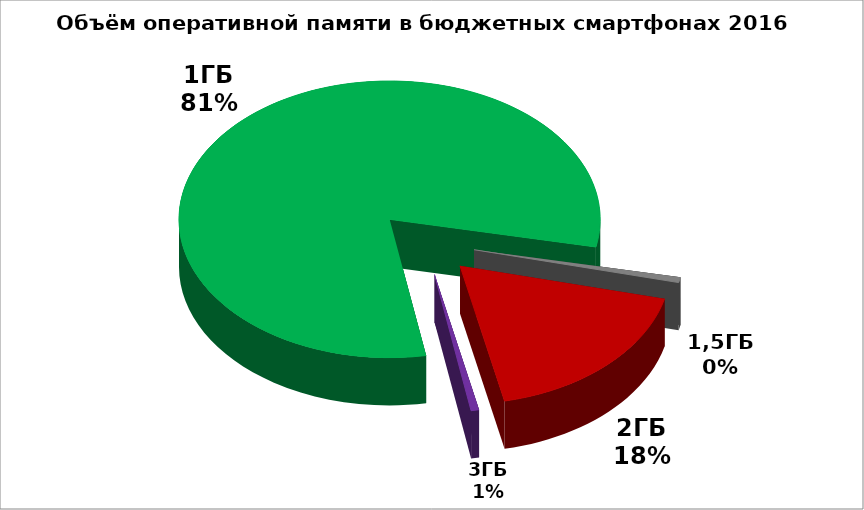
| Category | Series 0 |
|---|---|
| 1ГБ | 132 |
| 1,5ГБ | 1 |
| 2ГБ | 29 |
| 3ГБ | 1 |